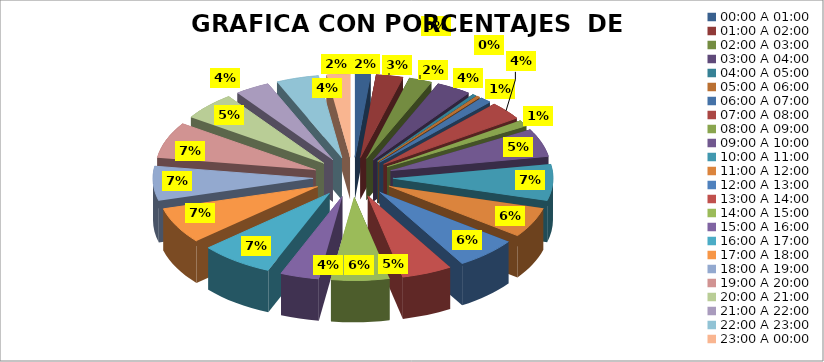
| Category | COMPUTO |
|---|---|
| 00:00 A 01:00 | 4 |
| 01:00 A 02:00 | 7 |
| 02:00 A 03:00 | 6 |
| 03:00 A 04:00 | 9 |
| 04:00 A 05:00 | 1 |
| 05:00 A 06:00 | 1 |
| 06:00 A 07:00 | 3 |
| 07:00 A 08:00 | 9 |
| 08:00 A 09:00 | 3 |
| 09:00 A 10:00 | 14 |
| 10:00 A 11:00 | 18 |
| 11:00 A 12:00 | 15 |
| 12:00 A 13:00 | 16 |
| 13:00 A 14:00 | 13 |
| 14:00 A 15:00 | 15 |
| 15:00 A 16:00 | 10 |
| 16:00 A 17:00 | 19 |
| 17:00 A 18:00 | 18 |
| 18:00 A 19:00 | 17 |
| 19:00 A 20:00 | 18 |
| 20:00 A 21:00 | 14 |
| 21:00 A 22:00 | 9 |
| 22:00 A 23:00 | 11 |
| 23:00 A 00:00 | 6 |